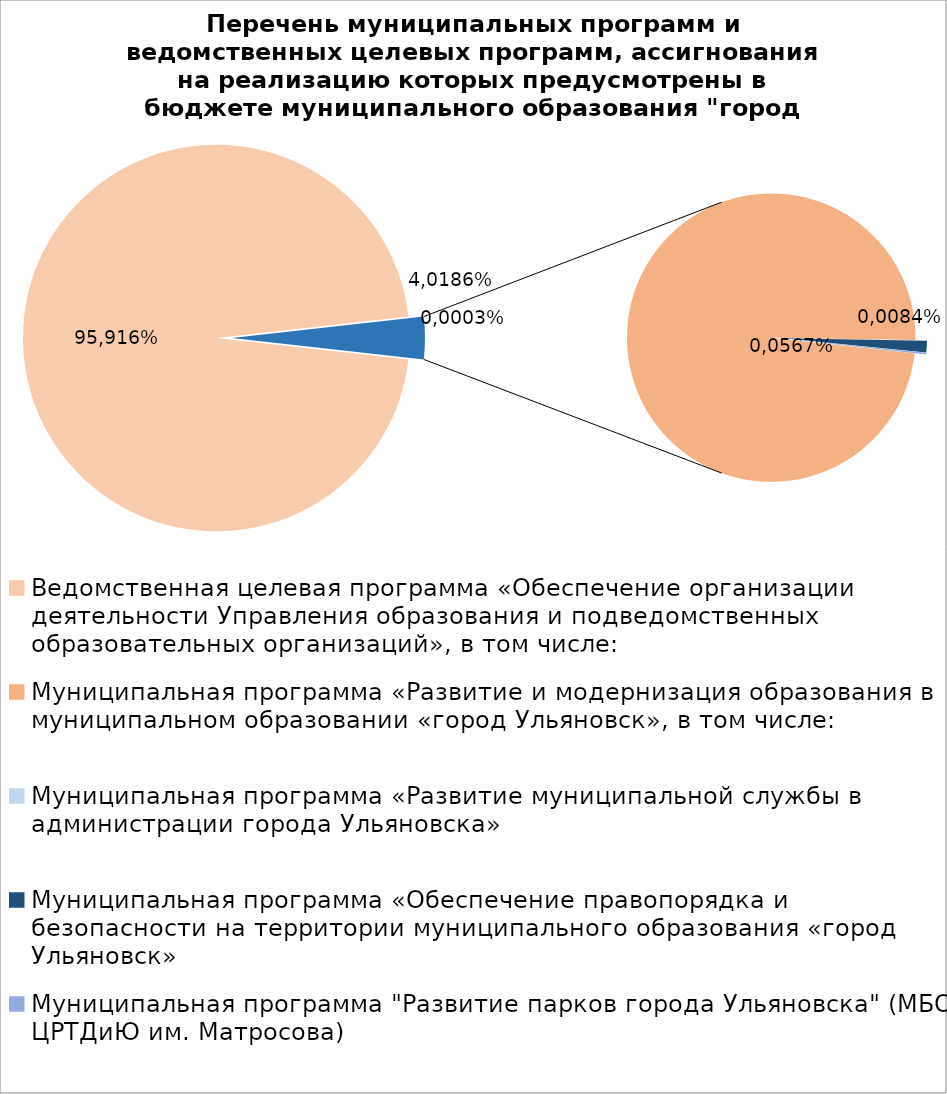
| Category | Series 0 |
|---|---|
| Ведомственная целевая программа «Обеспечение организации деятельности Управления образования и подведомственных образовательных организаций», в том числе: | 5671464.75 |
| Муниципальная программа «Развитие и модернизация образования в муниципальном образовании «город Ульяновск», в том числе: | 204821 |
| Муниципальная программа «Развитие муниципальной службы в администрации города Ульяновска» | 15.4 |
| Муниципальная программа «Обеспечение правопорядка и безопасности на территории муниципального образования «город Ульяновск» | 2700 |
| Муниципальная программа "Развитие парков города Ульяновска" (МБОУ ЦРТДиЮ им. Матросова) | 400 |